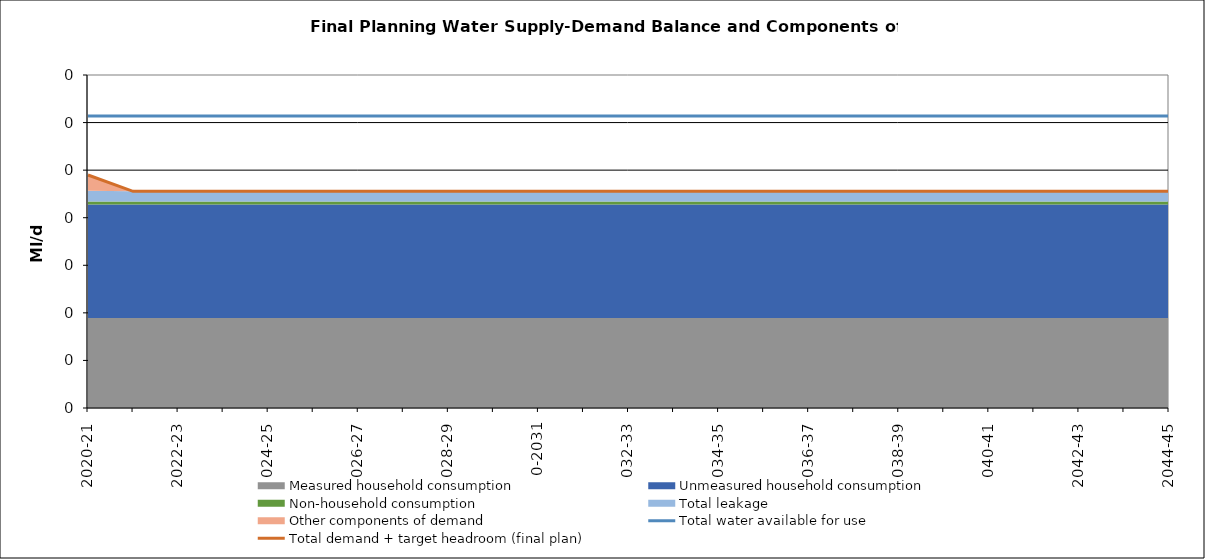
| Category | Total water available for use | Total demand + target headroom (final plan) |
|---|---|---|
| 0 | 0.307 | 0.245 |
| 1 | 0.307 | 0.228 |
| 2 | 0.307 | 0.228 |
| 3 | 0.307 | 0.228 |
| 4 | 0.307 | 0.228 |
| 5 | 0.307 | 0.228 |
| 6 | 0.307 | 0.228 |
| 7 | 0.307 | 0.228 |
| 8 | 0.307 | 0.228 |
| 9 | 0.307 | 0.228 |
| 10 | 0.307 | 0.228 |
| 11 | 0.307 | 0.228 |
| 12 | 0.307 | 0.228 |
| 13 | 0.307 | 0.228 |
| 14 | 0.307 | 0.228 |
| 15 | 0.307 | 0.228 |
| 16 | 0.307 | 0.228 |
| 17 | 0.307 | 0.228 |
| 18 | 0.307 | 0.228 |
| 19 | 0.307 | 0.228 |
| 20 | 0.307 | 0.228 |
| 21 | 0.307 | 0.228 |
| 22 | 0.307 | 0.228 |
| 23 | 0.307 | 0.228 |
| 24 | 0.307 | 0.228 |